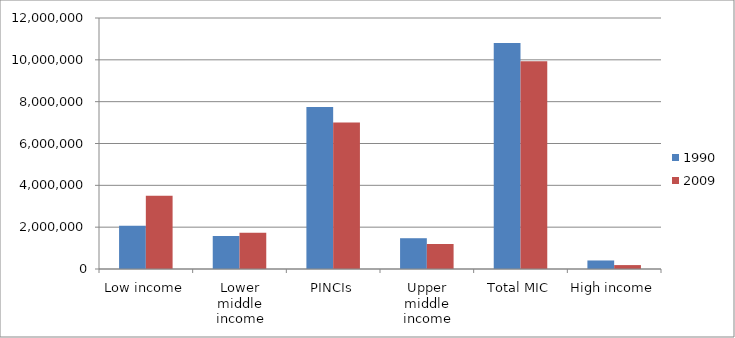
| Category | 1990 | 2009 |
|---|---|---|
| Low income | 2062350 | 3501860 |
| Lower middle income | 1578754 | 1735994 |
| PINCIs | 7750000 | 7000000 |
| Upper middle income | 1471709 | 1195719 |
| Total MIC | 10800463 | 9931713 |
| High income | 407845 | 187005 |